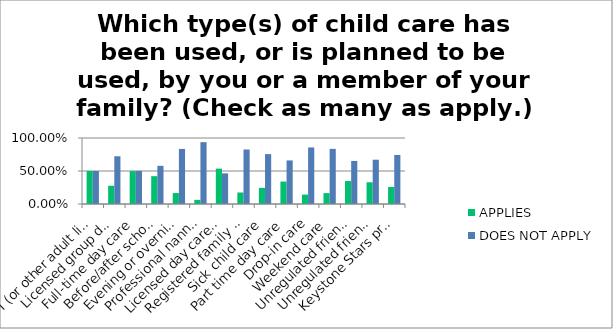
| Category | APPLIES | DOES NOT APPLY |
|---|---|---|
| I (or other adult living in my home) care for my child in my home the majority of the time | 0.5 | 0.5 |
| Licensed group day care home | 0.277 | 0.723 |
| Full-time day care | 0.498 | 0.502 |
| Before/after school care | 0.422 | 0.578 |
| Evening or overnight care | 0.166 | 0.834 |
| Professional nanny in my home | 0.063 | 0.937 |
| Licensed day care center | 0.536 | 0.464 |
| Registered family day care home | 0.174 | 0.826 |
| Sick child care | 0.244 | 0.756 |
| Part time day care | 0.34 | 0.66 |
| Drop-in care | 0.143 | 0.857 |
| Weekend care | 0.165 | 0.835 |
| Unregulated friend or family member in their home | 0.348 | 0.652 |
| Unregulated friend or family member who comes to my home | 0.329 | 0.671 |
| Keystone Stars provider | 0.257 | 0.743 |